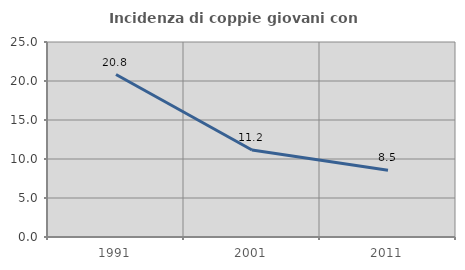
| Category | Incidenza di coppie giovani con figli |
|---|---|
| 1991.0 | 20.827 |
| 2001.0 | 11.158 |
| 2011.0 | 8.546 |